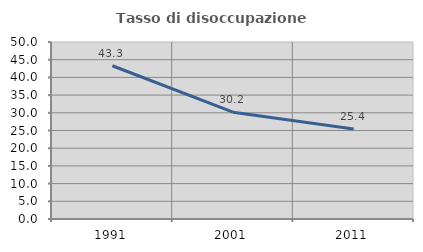
| Category | Tasso di disoccupazione giovanile  |
|---|---|
| 1991.0 | 43.286 |
| 2001.0 | 30.178 |
| 2011.0 | 25.402 |